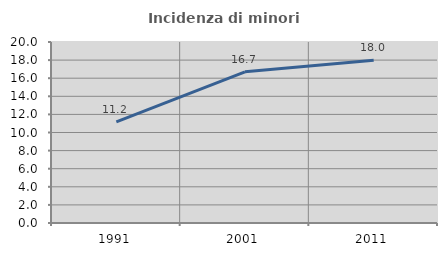
| Category | Incidenza di minori stranieri |
|---|---|
| 1991.0 | 11.177 |
| 2001.0 | 16.707 |
| 2011.0 | 17.993 |